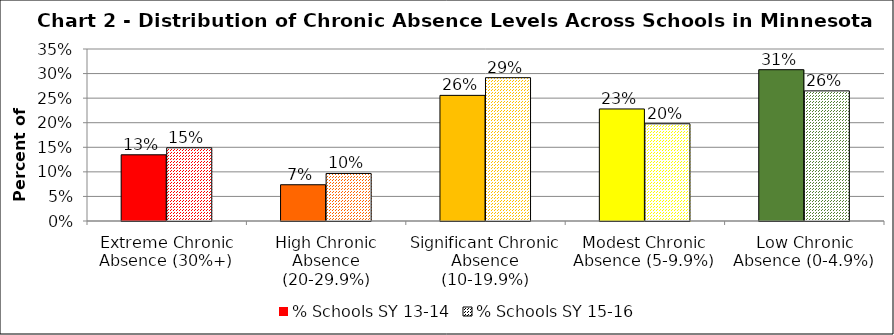
| Category | % Schools SY 13-14 | % Schools SY 15-16 |
|---|---|---|
| Extreme Chronic Absence (30%+) | 0.135 | 0.149 |
| High Chronic Absence (20-29.9%) | 0.074 | 0.097 |
| Significant Chronic Absence (10-19.9%) | 0.256 | 0.292 |
| Modest Chronic Absence (5-9.9%) | 0.228 | 0.198 |
| Low Chronic Absence (0-4.9%) | 0.308 | 0.265 |